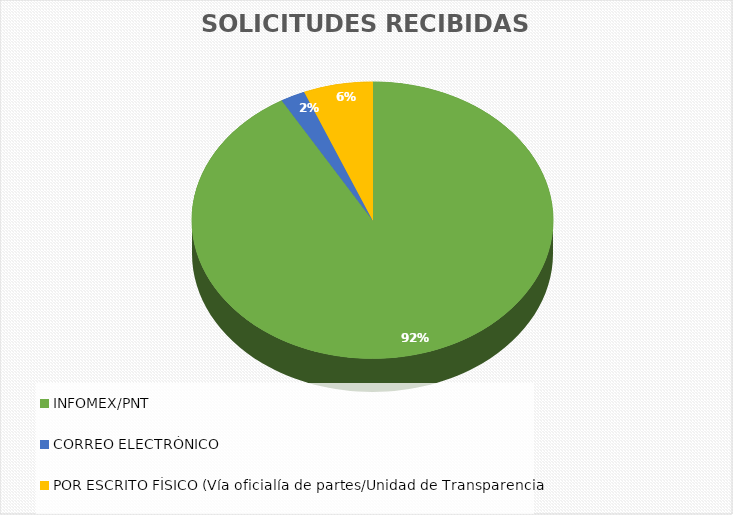
| Category | Series 0 |
|---|---|
| INFOMEX/PNT | 1914 |
| CORREO ELECTRÓNICO | 46 |
| POR ESCRITO FÍSICO (Vía oficialía de partes/Unidad de Transparencia) | 129 |